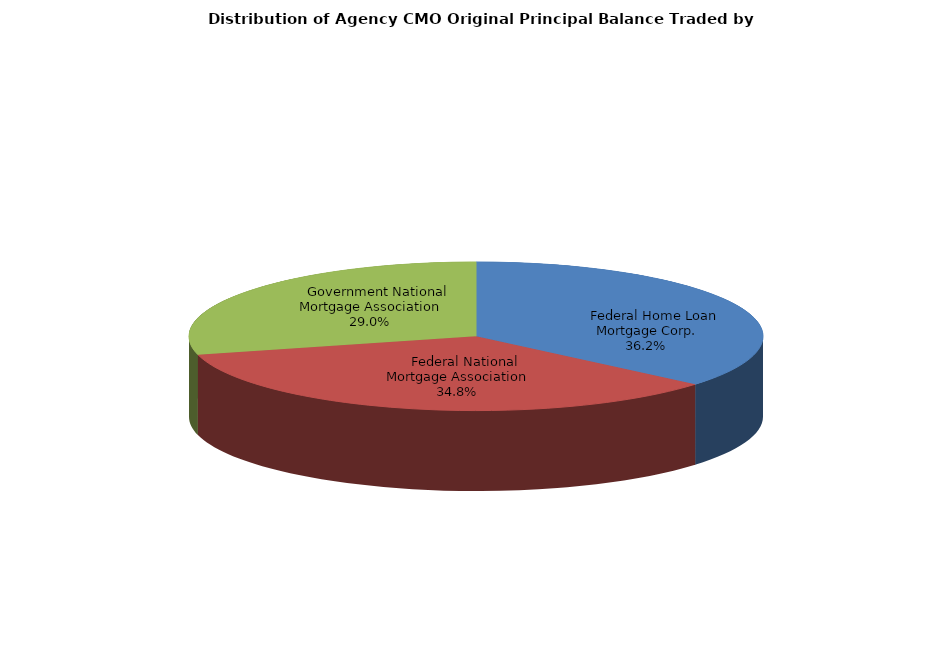
| Category | Series 0 |
|---|---|
|     Federal Home Loan Mortgage Corp. | 1935052989.727 |
|     Federal National Mortgage Association | 1863686772.429 |
|     Government National Mortgage Association | 1550216714.293 |